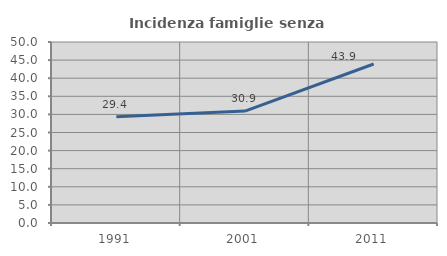
| Category | Incidenza famiglie senza nuclei |
|---|---|
| 1991.0 | 29.371 |
| 2001.0 | 30.909 |
| 2011.0 | 43.929 |